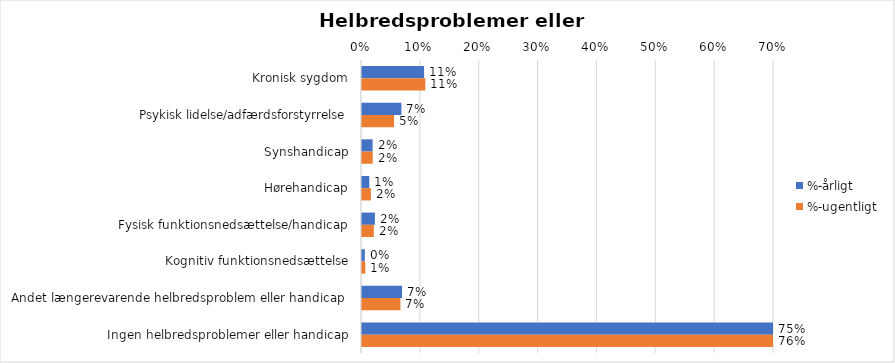
| Category | %-årligt | %-ugentligt |
|---|---|---|
| Kronisk sygdom | 0.105 | 0.108 |
| Psykisk lidelse/adfærdsforstyrrelse | 0.067 | 0.054 |
| Synshandicap | 0.018 | 0.018 |
| Hørehandicap | 0.012 | 0.015 |
| Fysisk funktionsnedsættelse/handicap | 0.022 | 0.02 |
| Kognitiv funktionsnedsættelse | 0.005 | 0.006 |
| Andet længerevarende helbredsproblem eller handicap  | 0.068 | 0.065 |
| Ingen helbredsproblemer eller handicap | 0.748 | 0.757 |